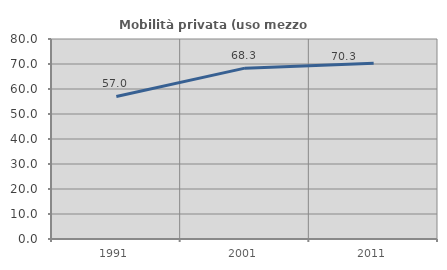
| Category | Mobilità privata (uso mezzo privato) |
|---|---|
| 1991.0 | 57.009 |
| 2001.0 | 68.337 |
| 2011.0 | 70.319 |